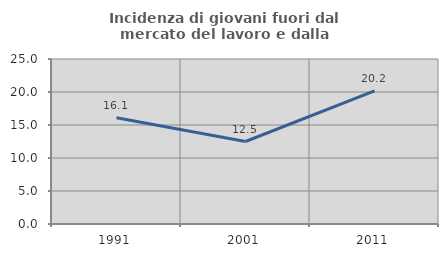
| Category | Incidenza di giovani fuori dal mercato del lavoro e dalla formazione  |
|---|---|
| 1991.0 | 16.092 |
| 2001.0 | 12.5 |
| 2011.0 | 20.183 |